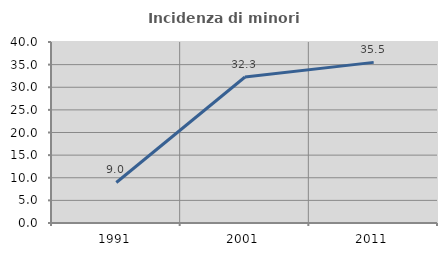
| Category | Incidenza di minori stranieri |
|---|---|
| 1991.0 | 8.955 |
| 2001.0 | 32.258 |
| 2011.0 | 35.496 |